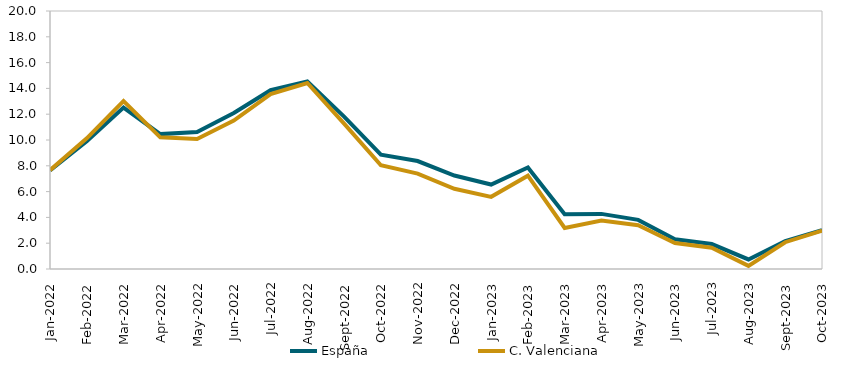
| Category | España | C. Valenciana |
|---|---|---|
| 2022-01-01 | 7.632 | 7.658 |
| 2022-02-01 | 9.904 | 10.132 |
| 2022-03-01 | 12.509 | 13.01 |
| 2022-04-01 | 10.457 | 10.206 |
| 2022-05-01 | 10.624 | 10.076 |
| 2022-06-01 | 12.098 | 11.503 |
| 2022-07-01 | 13.858 | 13.563 |
| 2022-08-01 | 14.535 | 14.421 |
| 2022-09-01 | 11.814 | 11.275 |
| 2022-10-01 | 8.857 | 8.044 |
| 2022-11-01 | 8.369 | 7.394 |
| 2022-12-01 | 7.246 | 6.219 |
| 2023-01-01 | 6.547 | 5.593 |
| 2023-02-01 | 7.873 | 7.231 |
| 2023-03-01 | 4.244 | 3.183 |
| 2023-04-01 | 4.271 | 3.757 |
| 2023-05-01 | 3.808 | 3.389 |
| 2023-06-01 | 2.303 | 2.01 |
| 2023-07-01 | 1.935 | 1.649 |
| 2023-08-01 | 0.741 | 0.243 |
| 2023-09-01 | 2.16 | 2.077 |
| 2023-10-01 | 3.016 | 2.979 |